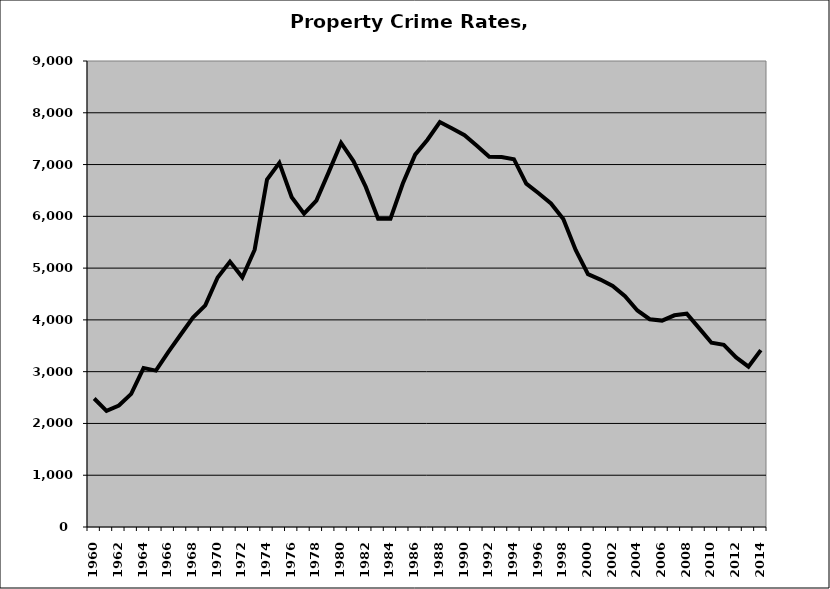
| Category | Property |
|---|---|
| 1960.0 | 2481.198 |
| 1961.0 | 2243.278 |
| 1962.0 | 2345.265 |
| 1963.0 | 2571.001 |
| 1964.0 | 3068.203 |
| 1965.0 | 3020.689 |
| 1966.0 | 3378.488 |
| 1967.0 | 3713.294 |
| 1968.0 | 4045.357 |
| 1969.0 | 4279.666 |
| 1970.0 | 4818.981 |
| 1971.0 | 5125.181 |
| 1972.0 | 4822.345 |
| 1973.0 | 5355.718 |
| 1974.0 | 6709.703 |
| 1975.0 | 7032.703 |
| 1976.0 | 6368.4 |
| 1977.0 | 6051.751 |
| 1978.0 | 6303.933 |
| 1979.0 | 6854.187 |
| 1980.0 | 7418.435 |
| 1981.0 | 7067.381 |
| 1982.0 | 6568.414 |
| 1983.0 | 5954.438 |
| 1984.0 | 5953.253 |
| 1985.0 | 6633.099 |
| 1986.0 | 7191.872 |
| 1987.0 | 7478.724 |
| 1988.0 | 7819.9 |
| 1989.0 | 7695.067 |
| 1990.0 | 7566.468 |
| 1991.0 | 7362.883 |
| 1992.0 | 7151.045 |
| 1993.0 | 7144.989 |
| 1994.0 | 7103.168 |
| 1995.0 | 6630.58 |
| 1996.0 | 6446.34 |
| 1997.0 | 6248.212 |
| 1998.0 | 5947.352 |
| 1999.0 | 5351.472 |
| 2000.0 | 4882.734 |
| 2001.0 | 4779.217 |
| 2002.0 | 4656.422 |
| 2003.0 | 4457.25 |
| 2004.0 | 4182.473 |
| 2005.0 | 4012.778 |
| 2006.0 | 3986.21 |
| 2007.0 | 4088.779 |
| 2008.0 | 4119.144 |
| 2009.0 | 3840.82 |
| 2010.0 | 3558.449 |
| 2011.0 | 3517.403 |
| 2012.0 | 3276.208 |
| 2013.0 | 3097.757 |
| 2014.0 | 3415.452 |